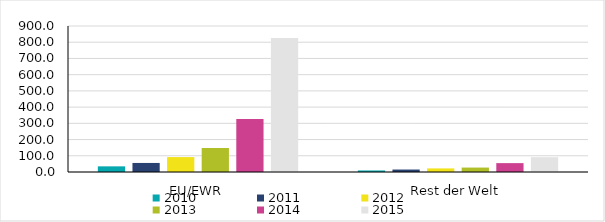
| Category | 2010 | 2011 | 2012 | 2013 | 2014 | 2015 |
|---|---|---|---|---|---|---|
| EU/EWR | 34.839 | 55.762 | 91.878 | 148.087 | 326.775 | 826.153 |
| Rest der Welt | 9.567 | 15.2 | 22.111 | 27.331 | 54.737 | 91.299 |